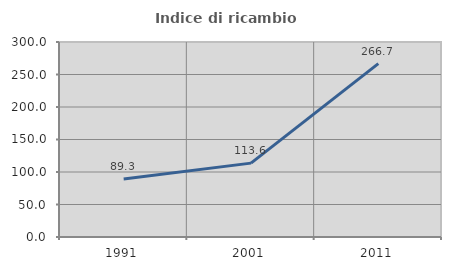
| Category | Indice di ricambio occupazionale  |
|---|---|
| 1991.0 | 89.32 |
| 2001.0 | 113.636 |
| 2011.0 | 266.667 |